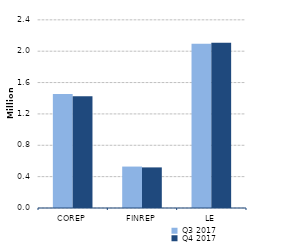
| Category | Q3 2017 | Q4 2017 |
|---|---|---|
| 0 | 1455149 | 1425434 |
| 1 | 528465 | 517899 |
| 2 | 2094305 | 2106491 |